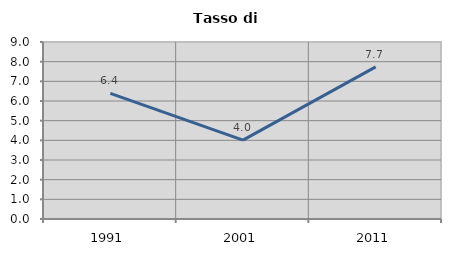
| Category | Tasso di disoccupazione   |
|---|---|
| 1991.0 | 6.385 |
| 2001.0 | 4.01 |
| 2011.0 | 7.733 |